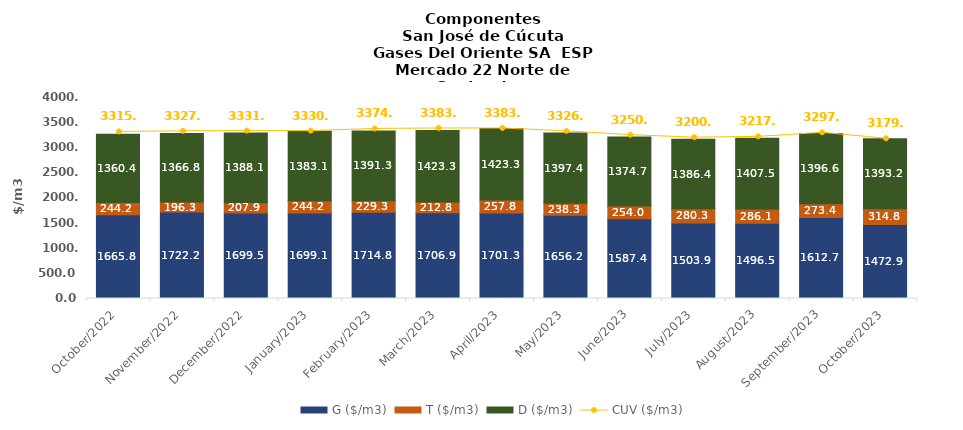
| Category | G ($/m3) | T ($/m3) | D ($/m3) |
|---|---|---|---|
| 2022-10-01 | 1665.75 | 244.23 | 1360.41 |
| 2022-11-01 | 1722.18 | 196.33 | 1366.84 |
| 2022-12-01 | 1699.54 | 207.91 | 1388.06 |
| 2023-01-01 | 1699.06 | 244.23 | 1383.12 |
| 2023-02-01 | 1714.78 | 229.32 | 1391.26 |
| 2023-03-01 | 1706.94 | 212.77 | 1423.33 |
| 2023-04-01 | 1701.33 | 257.81 | 1423.3 |
| 2023-05-01 | 1656.2 | 238.29 | 1397.37 |
| 2023-06-01 | 1587.41 | 254 | 1374.66 |
| 2023-07-01 | 1503.89 | 280.27 | 1386.35 |
| 2023-08-01 | 1496.47 | 286.1 | 1407.49 |
| 2023-09-01 | 1612.68 | 273.44 | 1396.57 |
| 2023-10-01 | 1472.87 | 314.83 | 1393.18 |